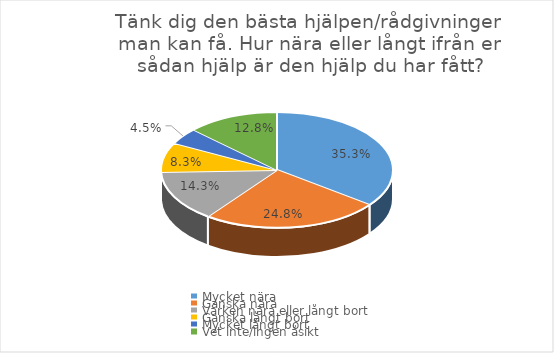
| Category | Series 0 |
|---|---|
| Mycket nära | 0.353 |
| Ganska nära | 0.248 |
| Varken nära eller långt bort | 0.143 |
| Ganska långt bort | 0.083 |
| Mycket långt bort | 0.045 |
| Vet inte/ingen åsikt | 0.128 |